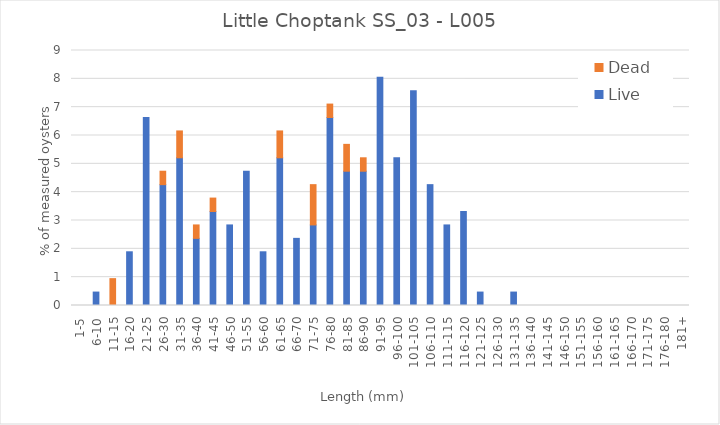
| Category | Live | Dead |
|---|---|---|
| 1-5 | 0 | 0 |
| 6-10 | 0.474 | 0 |
| 11-15 | 0 | 0.948 |
| 16-20 | 1.896 | 0 |
| 21-25 | 6.635 | 0 |
| 26-30 | 4.265 | 0.474 |
| 31-35 | 5.213 | 0.948 |
| 36-40 | 2.37 | 0.474 |
| 41-45 | 3.318 | 0.474 |
| 46-50 | 2.844 | 0 |
| 51-55 | 4.739 | 0 |
| 56-60 | 1.896 | 0 |
| 61-65 | 5.213 | 0.948 |
| 66-70 | 2.37 | 0 |
| 71-75 | 2.844 | 1.422 |
| 76-80 | 6.635 | 0.474 |
| 81-85 | 4.739 | 0.948 |
| 86-90 | 4.739 | 0.474 |
| 91-95 | 8.057 | 0 |
| 96-100 | 5.213 | 0 |
| 101-105 | 7.583 | 0 |
| 106-110 | 4.265 | 0 |
| 111-115 | 2.844 | 0 |
| 116-120 | 3.318 | 0 |
| 121-125 | 0.474 | 0 |
| 126-130 | 0 | 0 |
| 131-135 | 0.474 | 0 |
| 136-140 | 0 | 0 |
| 141-145 | 0 | 0 |
| 146-150 | 0 | 0 |
| 151-155 | 0 | 0 |
| 156-160 | 0 | 0 |
| 161-165 | 0 | 0 |
| 166-170 | 0 | 0 |
| 171-175 | 0 | 0 |
| 176-180 | 0 | 0 |
| 181+ | 0 | 0 |